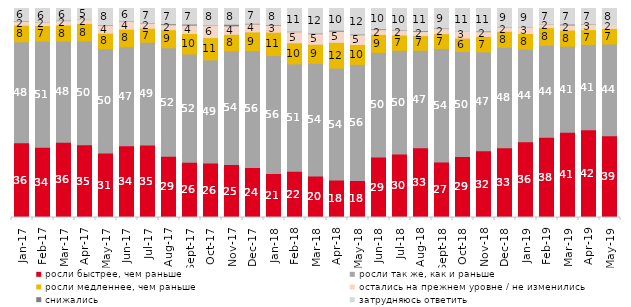
| Category | росли быстрее, чем раньше | росли так же, как и раньше | росли медленнее, чем раньше | остались на прежнем уровне / не изменились | снижались | затрудняюсь ответить |
|---|---|---|---|---|---|---|
| 2017-01-01 | 35.75 | 48.35 | 7.9 | 1.95 | 0.15 | 5.9 |
| 2017-02-01 | 33.65 | 50.75 | 7.45 | 1.8 | 0.1 | 6.25 |
| 2017-03-01 | 36 | 48.45 | 7.65 | 2.1 | 0.2 | 5.6 |
| 2017-04-01 | 34.85 | 49.65 | 8.35 | 1.85 | 0.1 | 5.2 |
| 2017-05-01 | 30.9 | 49.8 | 7.5 | 3.9 | 0.2 | 7.7 |
| 2017-06-01 | 34.3 | 47.4 | 8.4 | 3.95 | 0.15 | 5.8 |
| 2017-07-01 | 34.65 | 49.2 | 6.7 | 2.3 | 0.15 | 7 |
| 2017-08-01 | 29.3 | 51.9 | 8.65 | 2.4 | 0.45 | 7.3 |
| 2017-09-01 | 26.4 | 51.8 | 9.85 | 4 | 0.5 | 7.45 |
| 2017-10-01 | 26.1 | 49.3 | 10.65 | 5.8 | 0.15 | 8 |
| 2017-11-01 | 25.35 | 54.4 | 7.9 | 4.05 | 0.75 | 7.55 |
| 2017-12-01 | 23.95 | 55.95 | 8.9 | 3.8 | 0.3 | 7.1 |
| 2018-01-01 | 21.1 | 56.35 | 11.2 | 3.35 | 0.25 | 7.75 |
| 2018-02-01 | 22.1 | 51.4 | 10.1 | 5.3 | 0.2 | 10.9 |
| 2018-03-01 | 19.8 | 54 | 9.1 | 5.05 | 0.25 | 11.8 |
| 2018-04-01 | 17.95 | 53.55 | 12.3 | 5.35 | 0.45 | 10.4 |
| 2018-05-01 | 17.75 | 55.5 | 9.55 | 4.65 | 0.3 | 12.25 |
| 2018-06-01 | 28.9 | 50.1 | 8.6 | 2.3 | 0.35 | 9.75 |
| 2018-07-01 | 30.35 | 49.6 | 7.35 | 2.4 | 0.15 | 10.15 |
| 2018-08-01 | 33.35 | 46.65 | 7.05 | 2 | 0.35 | 10.6 |
| 2018-09-01 | 26.55 | 54.35 | 7.05 | 2.45 | 0.2 | 9.4 |
| 2018-10-01 | 29.2 | 50.2 | 6.45 | 3.15 | 0.05 | 10.95 |
| 2018-11-01 | 31.886 | 47.355 | 7.435 | 2.246 | 0.299 | 10.778 |
| 2018-12-01 | 33.4 | 48 | 7.7 | 2.1 | 0.05 | 8.75 |
| 2019-01-01 | 36.25 | 44.25 | 7.55 | 2.85 | 0.1 | 9 |
| 2019-02-01 | 38.35 | 44.05 | 8.45 | 1.85 | 0.05 | 7.25 |
| 2019-03-01 | 40.825 | 41.124 | 7.708 | 2.486 | 0.398 | 7.459 |
| 2019-04-01 | 42.03 | 40.792 | 7.079 | 2.723 | 0.149 | 7.228 |
| 2019-05-01 | 39.079 | 43.933 | 7.429 | 1.783 | 0 | 7.776 |